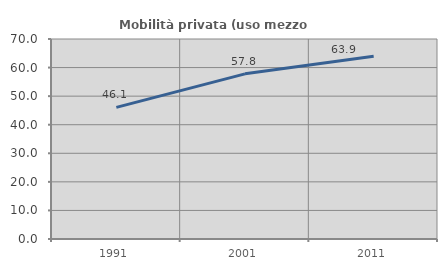
| Category | Mobilità privata (uso mezzo privato) |
|---|---|
| 1991.0 | 46.053 |
| 2001.0 | 57.801 |
| 2011.0 | 63.926 |